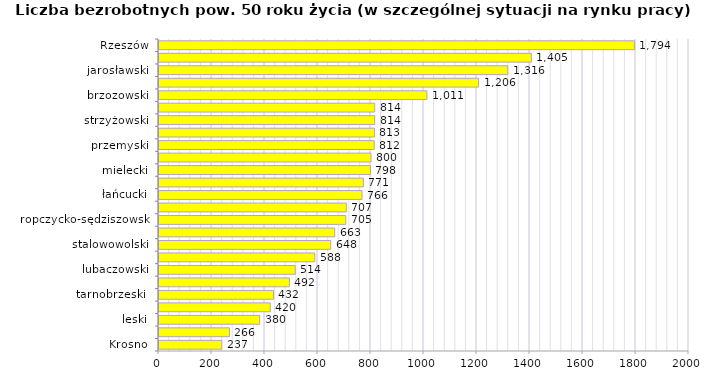
| Category | Liczba bezrobotnych powyżej 50 roku życia - w szczególnej sytuacji na rynku pracy |
|---|---|
| Krosno | 237 |
| bieszczadzki | 266 |
| leski | 380 |
| Tarnobrzeg | 420 |
| tarnobrzeski  | 432 |
| kolbuszowski | 492 |
| lubaczowski | 514 |
| krośnieński | 588 |
| stalowowolski | 648 |
| sanocki | 663 |
| ropczycko-sędziszowski | 705 |
| dębicki | 707 |
| łańcucki | 766 |
| przeworski | 771 |
| mielecki | 798 |
| leżajski | 800 |
| przemyski | 812 |
| niżański | 813 |
| strzyżowski | 814 |
| Przemyśl | 814 |
| brzozowski | 1011 |
| jasielski | 1206 |
| jarosławski | 1316 |
| rzeszowski | 1405 |
| Rzeszów | 1794 |